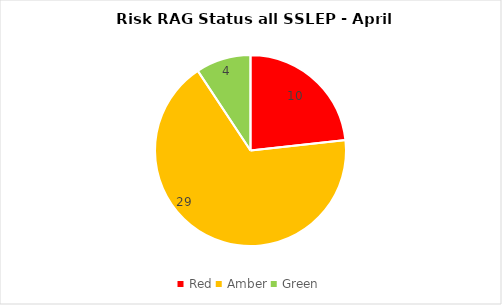
| Category | SSLEP |
|---|---|
| Red | 10 |
| Amber | 29 |
| Green | 4 |